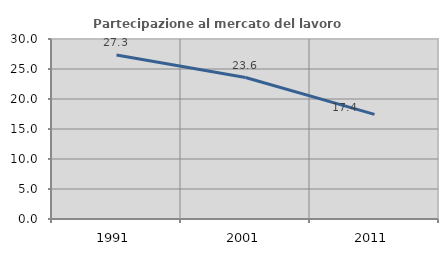
| Category | Partecipazione al mercato del lavoro  femminile |
|---|---|
| 1991.0 | 27.344 |
| 2001.0 | 23.582 |
| 2011.0 | 17.445 |